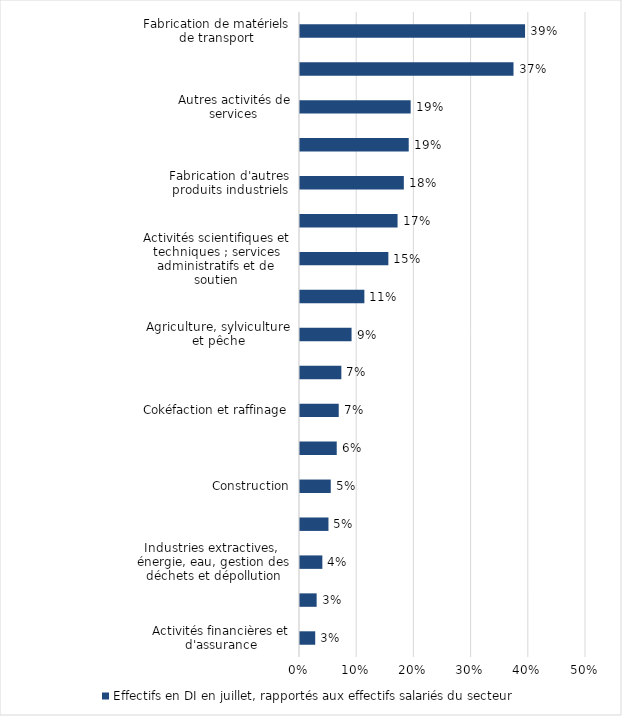
| Category | Effectifs en DI en juillet, rapportés aux effectifs salariés du secteur |
|---|---|
| Activités financières et d'assurance | 0.027 |
| Activités immobilières | 0.029 |
| Industries extractives,  énergie, eau, gestion des déchets et dépollution | 0.039 |
| Administration publique, enseignement, santé humaine et action sociale | 0.05 |
| Construction | 0.054 |
| Fabrication de denrées alimentaires, de boissons et  de produits à base de tabac | 0.064 |
| Cokéfaction et raffinage | 0.068 |
| Commerce ; réparation d'automobiles et de motocycles | 0.072 |
| Agriculture, sylviculture et pêche | 0.09 |
| Information et communication | 0.113 |
| Activités scientifiques et techniques ; services administratifs et de soutien | 0.154 |
| Fabrication d'équipements électriques, électroniques, informatiques ; fabrication de machines | 0.171 |
| Fabrication d'autres produits industriels | 0.182 |
| Transports et entreposage | 0.19 |
| Autres activités de services | 0.193 |
| Hébergement et restauration | 0.373 |
| Fabrication de matériels de transport | 0.393 |